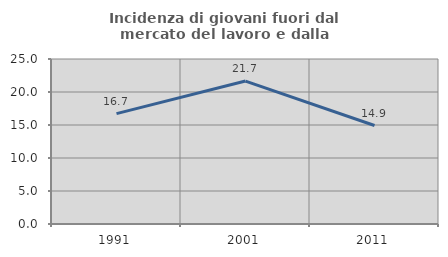
| Category | Incidenza di giovani fuori dal mercato del lavoro e dalla formazione  |
|---|---|
| 1991.0 | 16.724 |
| 2001.0 | 21.659 |
| 2011.0 | 14.921 |